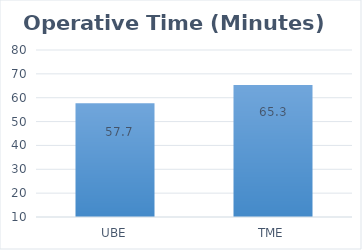
| Category | Series 0 |
|---|---|
| UBE | 57.7 |
| TME | 65.3 |